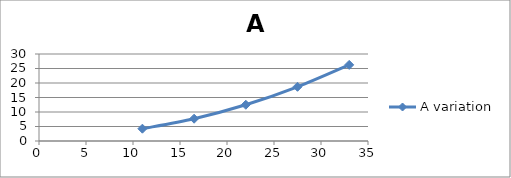
| Category | A variation |
|---|---|
| 11.0 | 4.25 |
| 16.5 | 7.688 |
| 22.0 | 12.5 |
| 27.5 | 18.688 |
| 33.0 | 26.25 |